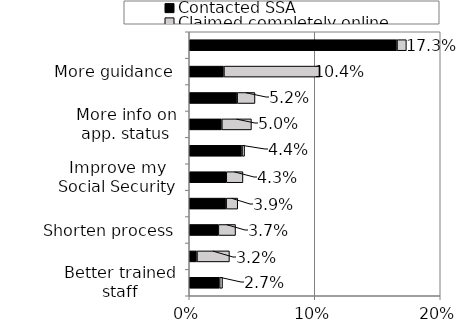
| Category | Contacted SSA | Claimed completely online |
|---|---|---|
| Better trained staff | 0.024 | 0.002 |
| Fewer forms | 0.006 | 0.026 |
| Shorten process | 0.023 | 0.014 |
| Inprove SSA website | 0.029 | 0.009 |
| Improve my Social Security | 0.03 | 0.013 |
| More staff | 0.042 | 0.002 |
| More info on app. status | 0.026 | 0.024 |
| Improve customer service | 0.038 | 0.014 |
| More guidance | 0.028 | 0.077 |
| Shorten wait times | 0.166 | 0.007 |